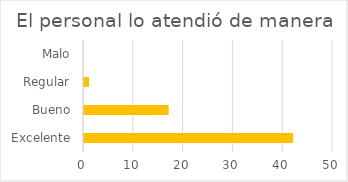
| Category | Series 0 |
|---|---|
| Excelente | 42 |
| Bueno | 17 |
| Regular | 1 |
| Malo | 0 |